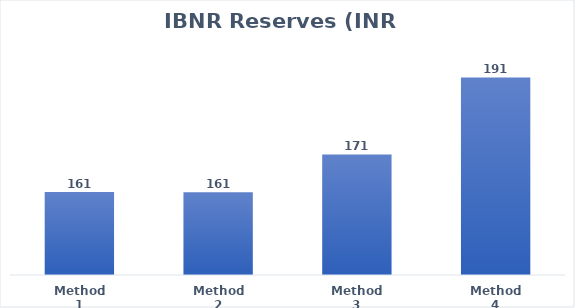
| Category | Series 0 |
|---|---|
| Method 1 | 161.482 |
| Method 2 | 161.412 |
| Method 3 | 171.185 |
| Method 4 | 191.102 |